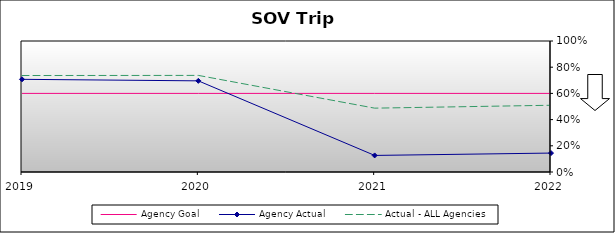
| Category | Agency Goal | Agency Actual | Actual - ALL Agencies |
|---|---|---|---|
| 2019.0 | 0.6 | 0.708 | 0.736 |
| 2020.0 | 0.6 | 0.696 | 0.737 |
| 2021.0 | 0.6 | 0.126 | 0.487 |
| 2022.0 | 0.6 | 0.144 | 0.509 |